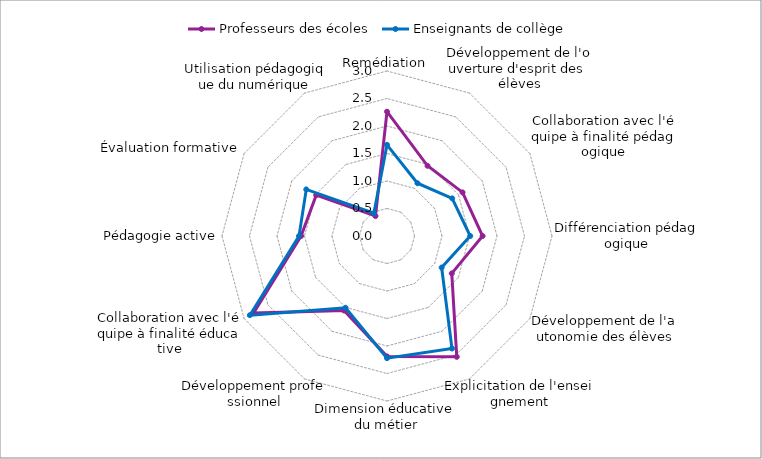
| Category | Professeurs des écoles | Enseignants de collège |
|---|---|---|
| Remédiation | 2.26 | 1.658 |
| Développement de l'ouverture d'esprit des élèves | 1.474 | 1.108 |
| Collaboration avec l'équipe à finalité pédagogique | 1.586 | 1.368 |
| Différenciation pédagogique | 1.738 | 1.513 |
| Développement de l'autonomie des élèves | 1.36 | 1.147 |
| Explicitation de l'enseignement | 2.537 | 2.362 |
| Dimension éducative du métier | 2.189 | 2.22 |
| Développement professionnel | 1.564 | 1.507 |
| Collaboration avec l'équipe à finalité éducative | 2.804 | 2.878 |
| Pédagogie active | 1.563 | 1.599 |
| Évaluation formative | 1.487 | 1.695 |
| Utilisation pédagogique du numérique | 0.419 | 0.477 |